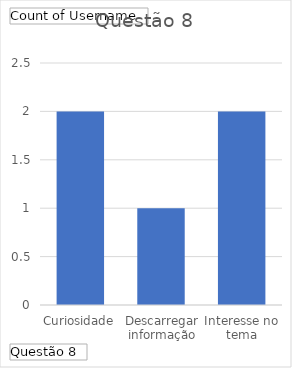
| Category | Total |
|---|---|
| Curiosidade | 2 |
| Descarregar informação | 1 |
| Interesse no tema | 2 |